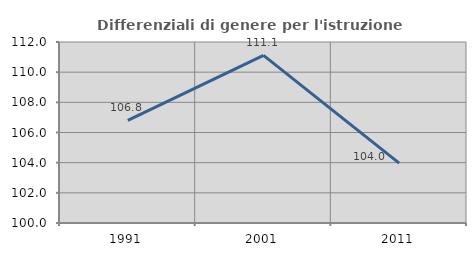
| Category | Differenziali di genere per l'istruzione superiore |
|---|---|
| 1991.0 | 106.798 |
| 2001.0 | 111.117 |
| 2011.0 | 103.969 |